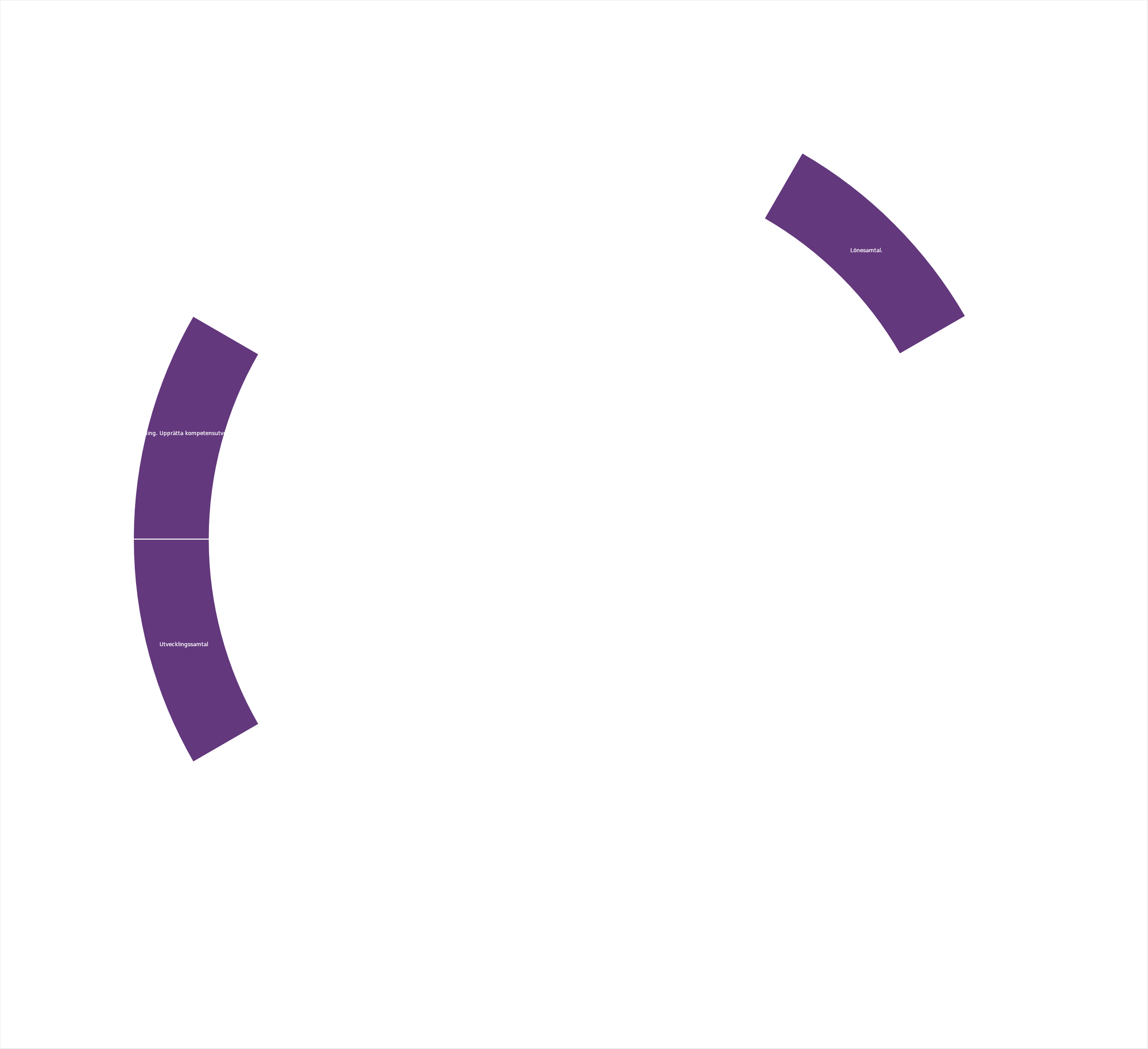
| Category | Series 0 |
|---|---|
|  | 1 |
| Lönesamtal. | 1 |
|  | 1 |
|  | 1 |
|  | 1 |
|  | 1 |
|  | 1 |
|  | 1 |
| Utvecklingssamtal | 1 |
| Lönekartläggning. Upprätta kompetensutvecklingsplan.  | 1 |